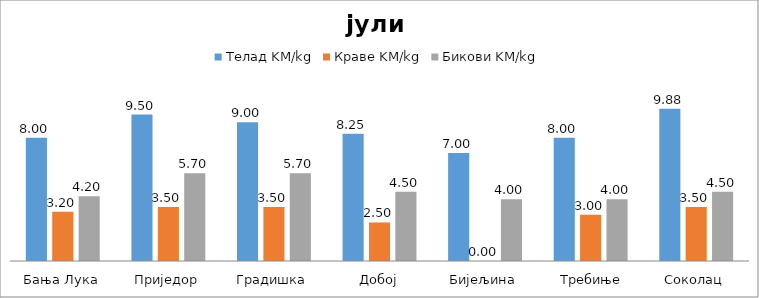
| Category | Телад KM/kg | Краве KM/kg | Бикови KM/kg |
|---|---|---|---|
| Бања Лука | 8 | 3.2 | 4.2 |
| Приједор | 9.5 | 3.5 | 5.7 |
| Градишка | 9 | 3.5 | 5.7 |
| Добој | 8.25 | 2.5 | 4.5 |
| Бијељина | 7 | 0 | 4 |
|  Требиње | 8 | 3 | 4 |
| Соколац | 9.875 | 3.5 | 4.5 |